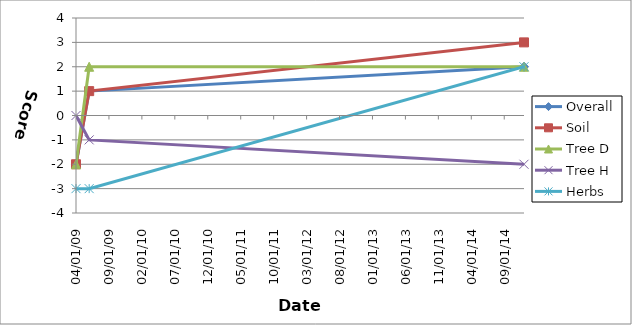
| Category | Overall | Soil | Tree D | Tree H | Herbs |
|---|---|---|---|---|---|
| 2009-04-11 | -2 | -2 | -2 | 0 | -3 |
| 2009-06-03 | 1 | 1 | 2 | -1 | -3 |
| 2014-12-09 | 2 | 3 | 2 | -2 | 2 |